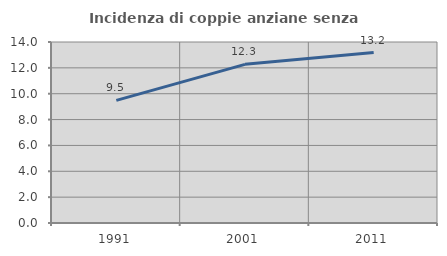
| Category | Incidenza di coppie anziane senza figli  |
|---|---|
| 1991.0 | 9.485 |
| 2001.0 | 12.273 |
| 2011.0 | 13.182 |